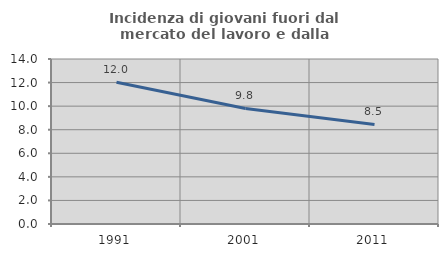
| Category | Incidenza di giovani fuori dal mercato del lavoro e dalla formazione  |
|---|---|
| 1991.0 | 12.03 |
| 2001.0 | 9.804 |
| 2011.0 | 8.451 |